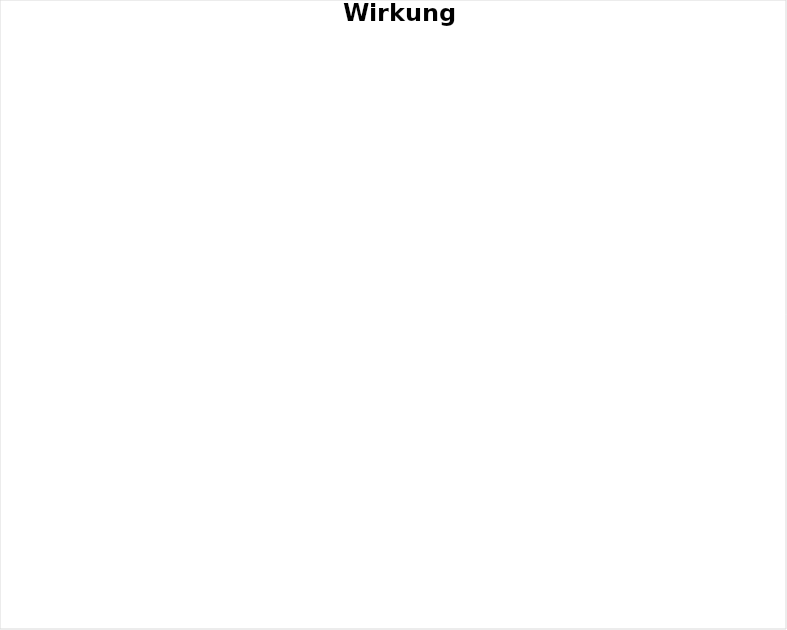
| Category | Series 0 |
|---|---|
| Kann selbstständig Wohnen | 0 |
| Kann selbstständig Wohnen mit Begleitung | 0 |
| Braucht den betreuten Rahmen | 0 |